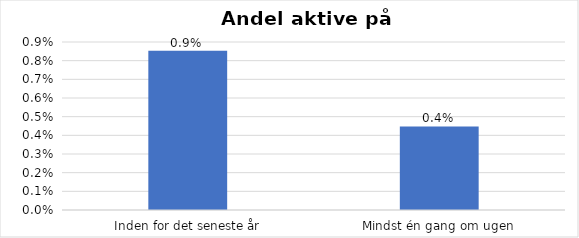
| Category | % |
|---|---|
| Inden for det seneste år | 0.009 |
| Mindst én gang om ugen | 0.004 |